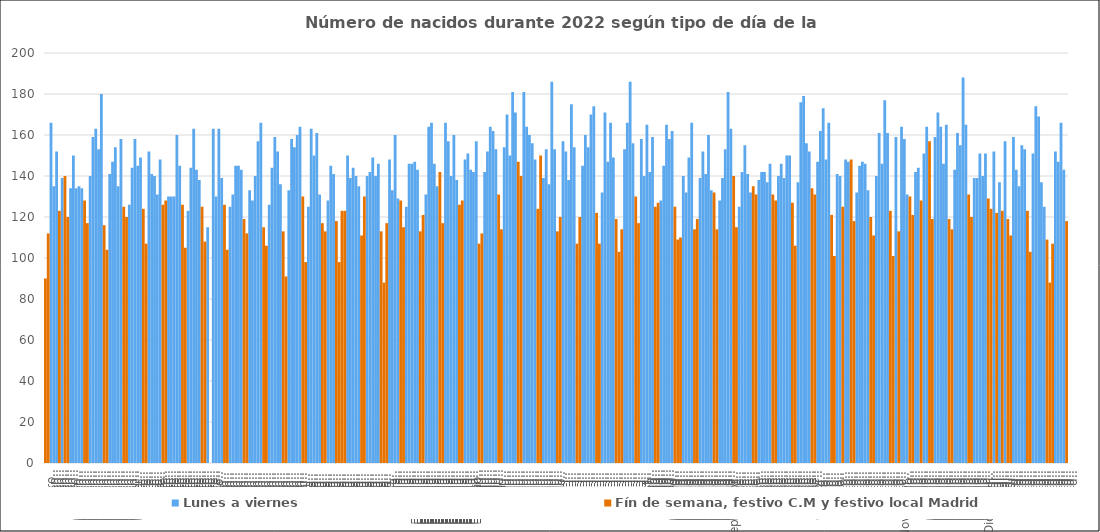
| Category | Lunes a viernes | Fín de semana, festivo C.M y festivo local Madrid |
|---|---|---|
| 0 | 0 | 90 |
| 1 | 0 | 112 |
| 2 | 166 | 0 |
| 3 | 135 | 0 |
| 4 | 152 | 0 |
| 5 | 0 | 123 |
| 6 | 139 | 0 |
| 7 | 0 | 140 |
| 8 | 0 | 120 |
| 9 | 134 | 0 |
| 10 | 150 | 0 |
| 11 | 134 | 0 |
| 12 | 135 | 0 |
| 13 | 134 | 0 |
| 14 | 0 | 128 |
| 15 | 0 | 117 |
| 16 | 140 | 0 |
| 17 | 159 | 0 |
| 18 | 163 | 0 |
| 19 | 153 | 0 |
| 20 | 180 | 0 |
| 21 | 0 | 116 |
| 22 | 0 | 104 |
| 23 | 141 | 0 |
| 24 | 147 | 0 |
| 25 | 154 | 0 |
| 26 | 135 | 0 |
| 27 | 158 | 0 |
| 28 | 0 | 125 |
| 29 | 0 | 120 |
| 30 | 126 | 0 |
| 31 | 144 | 0 |
| 32 | 158 | 0 |
| 33 | 145 | 0 |
| 34 | 149 | 0 |
| 35 | 0 | 124 |
| 36 | 0 | 107 |
| 37 | 152 | 0 |
| 38 | 141 | 0 |
| 39 | 140 | 0 |
| 40 | 131 | 0 |
| 41 | 148 | 0 |
| 42 | 0 | 126 |
| 43 | 0 | 128 |
| 44 | 130 | 0 |
| 45 | 130 | 0 |
| 46 | 130 | 0 |
| 47 | 160 | 0 |
| 48 | 145 | 0 |
| 49 | 0 | 126 |
| 50 | 0 | 105 |
| 51 | 123 | 0 |
| 52 | 144 | 0 |
| 53 | 163 | 0 |
| 54 | 143 | 0 |
| 55 | 138 | 0 |
| 56 | 0 | 125 |
| 57 | 0 | 108 |
| 58 | 115 | 0 |
| 59 | 0 | 0 |
| 60 | 163 | 0 |
| 61 | 130 | 0 |
| 62 | 163 | 0 |
| 63 | 139 | 0 |
| 64 | 0 | 126 |
| 65 | 0 | 104 |
| 66 | 125 | 0 |
| 67 | 131 | 0 |
| 68 | 145 | 0 |
| 69 | 145 | 0 |
| 70 | 143 | 0 |
| 71 | 0 | 119 |
| 72 | 0 | 112 |
| 73 | 133 | 0 |
| 74 | 128 | 0 |
| 75 | 140 | 0 |
| 76 | 157 | 0 |
| 77 | 166 | 0 |
| 78 | 0 | 115 |
| 79 | 0 | 106 |
| 80 | 126 | 0 |
| 81 | 144 | 0 |
| 82 | 159 | 0 |
| 83 | 152 | 0 |
| 84 | 136 | 0 |
| 85 | 0 | 113 |
| 86 | 0 | 91 |
| 87 | 133 | 0 |
| 88 | 158 | 0 |
| 89 | 154 | 0 |
| 90 | 160 | 0 |
| 91 | 164 | 0 |
| 92 | 0 | 130 |
| 93 | 0 | 98 |
| 94 | 125 | 0 |
| 95 | 163 | 0 |
| 96 | 150 | 0 |
| 97 | 161 | 0 |
| 98 | 131 | 0 |
| 99 | 0 | 117 |
| 100 | 0 | 113 |
| 101 | 128 | 0 |
| 102 | 145 | 0 |
| 103 | 141 | 0 |
| 104 | 0 | 118 |
| 105 | 0 | 98 |
| 106 | 0 | 123 |
| 107 | 0 | 123 |
| 108 | 150 | 0 |
| 109 | 139 | 0 |
| 110 | 144 | 0 |
| 111 | 140 | 0 |
| 112 | 135 | 0 |
| 113 | 0 | 111 |
| 114 | 0 | 130 |
| 115 | 140 | 0 |
| 116 | 142 | 0 |
| 117 | 149 | 0 |
| 118 | 140 | 0 |
| 119 | 146 | 0 |
| 120 | 0 | 113 |
| 121 | 0 | 88 |
| 122 | 0 | 117 |
| 123 | 148 | 0 |
| 124 | 133 | 0 |
| 125 | 160 | 0 |
| 126 | 129 | 0 |
| 127 | 0 | 128 |
| 128 | 0 | 115 |
| 129 | 125 | 0 |
| 130 | 146 | 0 |
| 131 | 146 | 0 |
| 132 | 147 | 0 |
| 133 | 143 | 0 |
| 134 | 0 | 113 |
| 135 | 0 | 121 |
| 136 | 131 | 0 |
| 137 | 164 | 0 |
| 138 | 166 | 0 |
| 139 | 146 | 0 |
| 140 | 135 | 0 |
| 141 | 0 | 142 |
| 142 | 0 | 117 |
| 143 | 166 | 0 |
| 144 | 157 | 0 |
| 145 | 140 | 0 |
| 146 | 160 | 0 |
| 147 | 138 | 0 |
| 148 | 0 | 126 |
| 149 | 0 | 128 |
| 150 | 148 | 0 |
| 151 | 151 | 0 |
| 152 | 143 | 0 |
| 153 | 142 | 0 |
| 154 | 157 | 0 |
| 155 | 0 | 107 |
| 156 | 0 | 112 |
| 157 | 142 | 0 |
| 158 | 152 | 0 |
| 159 | 164 | 0 |
| 160 | 162 | 0 |
| 161 | 153 | 0 |
| 162 | 0 | 131 |
| 163 | 0 | 114 |
| 164 | 154 | 0 |
| 165 | 170 | 0 |
| 166 | 150 | 0 |
| 167 | 181 | 0 |
| 168 | 171 | 0 |
| 169 | 0 | 147 |
| 170 | 0 | 140 |
| 171 | 181 | 0 |
| 172 | 164 | 0 |
| 173 | 160 | 0 |
| 174 | 156 | 0 |
| 175 | 148 | 0 |
| 176 | 0 | 124 |
| 177 | 0 | 150 |
| 178 | 139 | 0 |
| 179 | 153 | 0 |
| 180 | 136 | 0 |
| 181 | 186 | 0 |
| 182 | 153 | 0 |
| 183 | 0 | 113 |
| 184 | 0 | 120 |
| 185 | 157 | 0 |
| 186 | 152 | 0 |
| 187 | 138 | 0 |
| 188 | 175 | 0 |
| 189 | 154 | 0 |
| 190 | 0 | 107 |
| 191 | 0 | 120 |
| 192 | 145 | 0 |
| 193 | 160 | 0 |
| 194 | 154 | 0 |
| 195 | 170 | 0 |
| 196 | 174 | 0 |
| 197 | 0 | 122 |
| 198 | 0 | 107 |
| 199 | 132 | 0 |
| 200 | 171 | 0 |
| 201 | 147 | 0 |
| 202 | 166 | 0 |
| 203 | 149 | 0 |
| 204 | 0 | 119 |
| 205 | 0 | 103 |
| 206 | 0 | 114 |
| 207 | 153 | 0 |
| 208 | 166 | 0 |
| 209 | 186 | 0 |
| 210 | 156 | 0 |
| 211 | 0 | 130 |
| 212 | 0 | 117 |
| 213 | 158 | 0 |
| 214 | 140 | 0 |
| 215 | 165 | 0 |
| 216 | 142 | 0 |
| 217 | 159 | 0 |
| 218 | 0 | 125 |
| 219 | 0 | 127 |
| 220 | 128 | 0 |
| 221 | 145 | 0 |
| 222 | 165 | 0 |
| 223 | 158 | 0 |
| 224 | 162 | 0 |
| 225 | 0 | 125 |
| 226 | 0 | 109 |
| 227 | 0 | 110 |
| 228 | 140 | 0 |
| 229 | 132 | 0 |
| 230 | 149 | 0 |
| 231 | 166 | 0 |
| 232 | 0 | 114 |
| 233 | 0 | 119 |
| 234 | 139 | 0 |
| 235 | 152 | 0 |
| 236 | 141 | 0 |
| 237 | 160 | 0 |
| 238 | 133 | 0 |
| 239 | 0 | 132 |
| 240 | 0 | 114 |
| 241 | 128 | 0 |
| 242 | 139 | 0 |
| 243 | 153 | 0 |
| 244 | 181 | 0 |
| 245 | 163 | 0 |
| 246 | 0 | 140 |
| 247 | 0 | 115 |
| 248 | 125 | 0 |
| 249 | 142 | 0 |
| 250 | 155 | 0 |
| 251 | 141 | 0 |
| 252 | 132 | 0 |
| 253 | 0 | 135 |
| 254 | 0 | 131 |
| 255 | 138 | 0 |
| 256 | 142 | 0 |
| 257 | 142 | 0 |
| 258 | 137 | 0 |
| 259 | 146 | 0 |
| 260 | 0 | 131 |
| 261 | 0 | 128 |
| 262 | 140 | 0 |
| 263 | 146 | 0 |
| 264 | 139 | 0 |
| 265 | 150 | 0 |
| 266 | 150 | 0 |
| 267 | 0 | 127 |
| 268 | 0 | 106 |
| 269 | 137 | 0 |
| 270 | 176 | 0 |
| 271 | 179 | 0 |
| 272 | 156 | 0 |
| 273 | 152 | 0 |
| 274 | 0 | 134 |
| 275 | 0 | 131 |
| 276 | 147 | 0 |
| 277 | 162 | 0 |
| 278 | 173 | 0 |
| 279 | 148 | 0 |
| 280 | 166 | 0 |
| 281 | 0 | 121 |
| 282 | 0 | 101 |
| 283 | 141 | 0 |
| 284 | 140 | 0 |
| 285 | 0 | 125 |
| 286 | 148 | 0 |
| 287 | 147 | 0 |
| 288 | 0 | 148 |
| 289 | 0 | 118 |
| 290 | 132 | 0 |
| 291 | 145 | 0 |
| 292 | 147 | 0 |
| 293 | 146 | 0 |
| 294 | 133 | 0 |
| 295 | 0 | 120 |
| 296 | 0 | 111 |
| 297 | 140 | 0 |
| 298 | 161 | 0 |
| 299 | 146 | 0 |
| 300 | 177 | 0 |
| 301 | 161 | 0 |
| 302 | 0 | 123 |
| 303 | 0 | 101 |
| 304 | 159 | 0 |
| 305 | 0 | 113 |
| 306 | 164 | 0 |
| 307 | 158 | 0 |
| 308 | 131 | 0 |
| 309 | 0 | 130 |
| 310 | 0 | 121 |
| 311 | 142 | 0 |
| 312 | 144 | 0 |
| 313 | 0 | 128 |
| 314 | 151 | 0 |
| 315 | 164 | 0 |
| 316 | 0 | 157 |
| 317 | 0 | 119 |
| 318 | 159 | 0 |
| 319 | 171 | 0 |
| 320 | 164 | 0 |
| 321 | 146 | 0 |
| 322 | 165 | 0 |
| 323 | 0 | 119 |
| 324 | 0 | 114 |
| 325 | 143 | 0 |
| 326 | 161 | 0 |
| 327 | 155 | 0 |
| 328 | 188 | 0 |
| 329 | 165 | 0 |
| 330 | 0 | 131 |
| 331 | 0 | 120 |
| 332 | 139 | 0 |
| 333 | 139 | 0 |
| 334 | 151 | 0 |
| 335 | 140 | 0 |
| 336 | 151 | 0 |
| 337 | 0 | 129 |
| 338 | 0 | 124 |
| 339 | 152 | 0 |
| 340 | 0 | 122 |
| 341 | 137 | 0 |
| 342 | 0 | 123 |
| 343 | 157 | 0 |
| 344 | 0 | 119 |
| 345 | 0 | 111 |
| 346 | 159 | 0 |
| 347 | 143 | 0 |
| 348 | 135 | 0 |
| 349 | 155 | 0 |
| 350 | 153 | 0 |
| 351 | 0 | 123 |
| 352 | 0 | 103 |
| 353 | 151 | 0 |
| 354 | 174 | 0 |
| 355 | 169 | 0 |
| 356 | 137 | 0 |
| 357 | 125 | 0 |
| 358 | 0 | 109 |
| 359 | 0 | 88 |
| 360 | 0 | 107 |
| 361 | 152 | 0 |
| 362 | 147 | 0 |
| 363 | 166 | 0 |
| 364 | 143 | 0 |
| 365 | 0 | 118 |